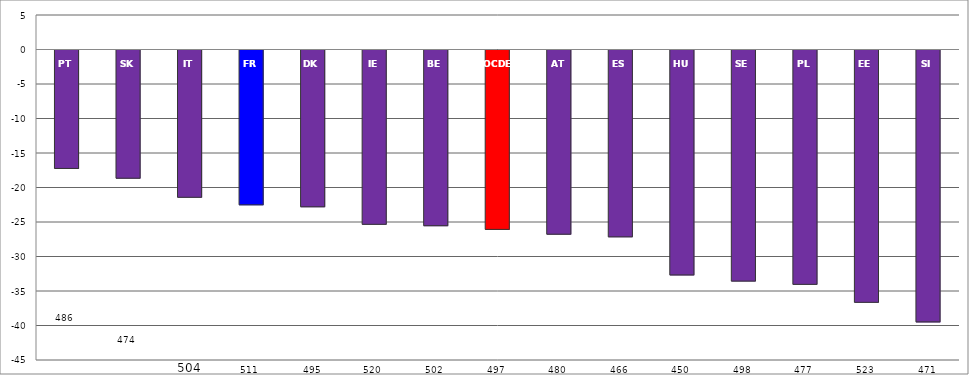
| Category | Différence de score Garçons moins Filles en lecture numérique |
|---|---|
| PT | -17.166 |
| SK | -18.582 |
| IT | -21.346 |
| FR | -22.443 |
| DK | -22.725 |
| IE | -25.263 |
| BE | -25.465 |
| OCDE | -25.998 |
| AT | -26.698 |
| ES | -27.082 |
| HU | -32.6 |
| SE | -33.494 |
| PL | -33.963 |
| EE | -36.569 |
| SI | -39.407 |